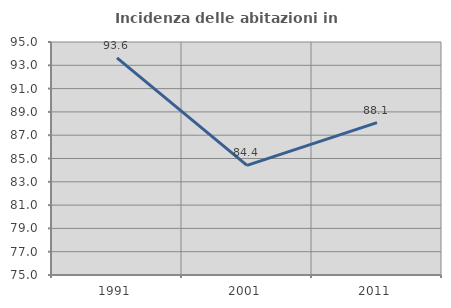
| Category | Incidenza delle abitazioni in proprietà  |
|---|---|
| 1991.0 | 93.642 |
| 2001.0 | 84.409 |
| 2011.0 | 88.083 |